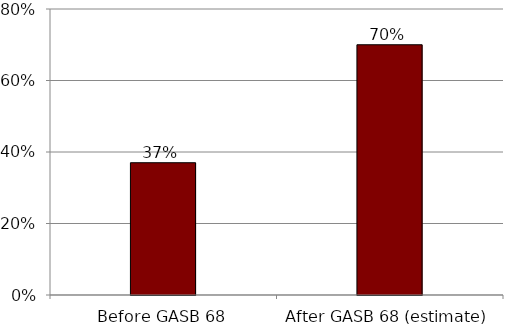
| Category | Series 0 |
|---|---|
| Before GASB 68 | 0.37 |
| After GASB 68 (estimate) | 0.7 |